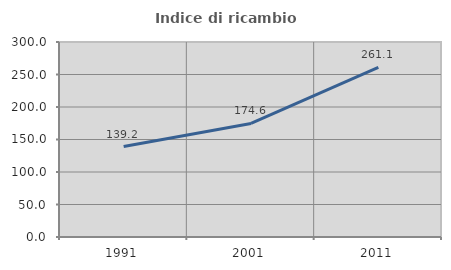
| Category | Indice di ricambio occupazionale  |
|---|---|
| 1991.0 | 139.201 |
| 2001.0 | 174.625 |
| 2011.0 | 261.141 |